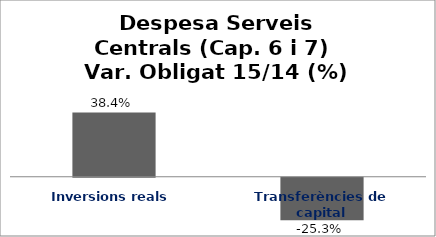
| Category | Series 0 |
|---|---|
| Inversions reals | 0.384 |
| Transferències de capital | -0.253 |